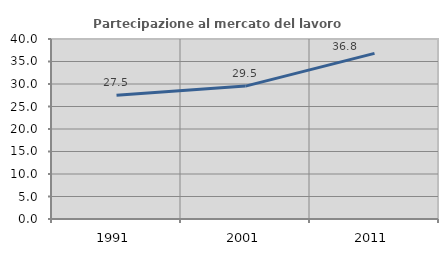
| Category | Partecipazione al mercato del lavoro  femminile |
|---|---|
| 1991.0 | 27.517 |
| 2001.0 | 29.533 |
| 2011.0 | 36.814 |